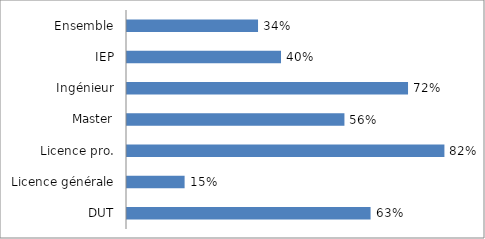
| Category | Series 0 |
|---|---|
| DUT | 0.628 |
| Licence générale | 0.149 |
| Licence pro. | 0.819 |
| Master | 0.561 |
| Ingénieur | 0.725 |
| IEP | 0.397 |
| Ensemble | 0.338 |